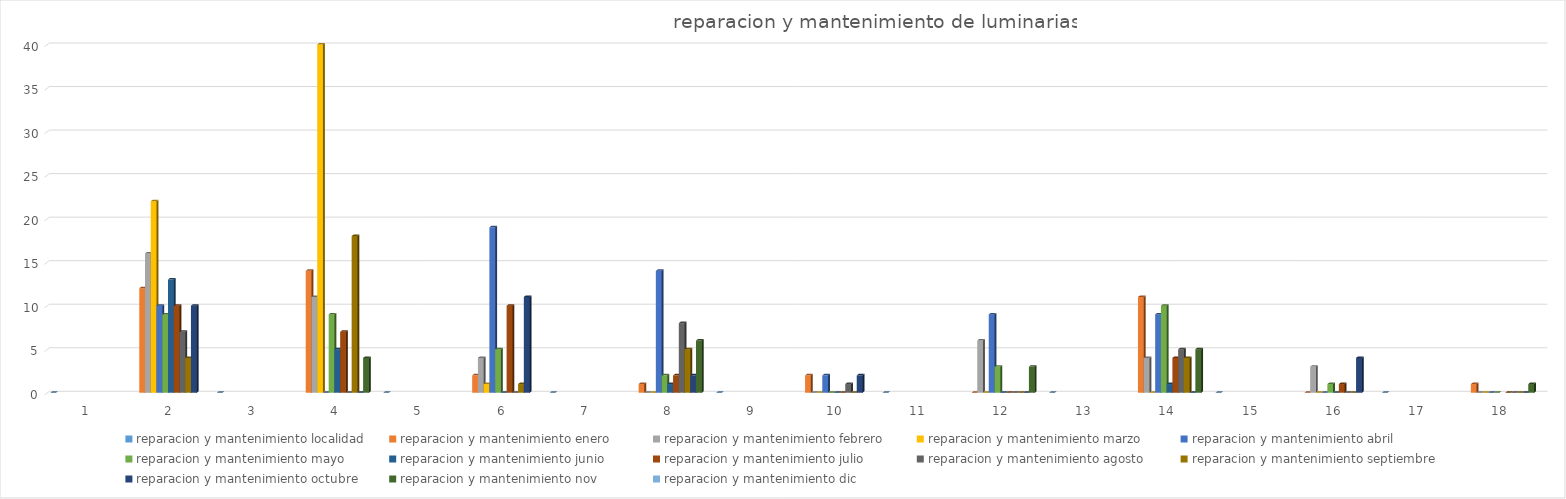
| Category | reparacion y mantenimiento |
|---|---|
| 0 |  |
| 1 |  |
| 2 |  |
| 3 |  |
| 4 |  |
| 5 |  |
| 6 |  |
| 7 |  |
| 8 |  |
| 9 |  |
| 10 |  |
| 11 |  |
| 12 |  |
| 13 |  |
| 14 |  |
| 15 |  |
| 16 |  |
| 17 |  |